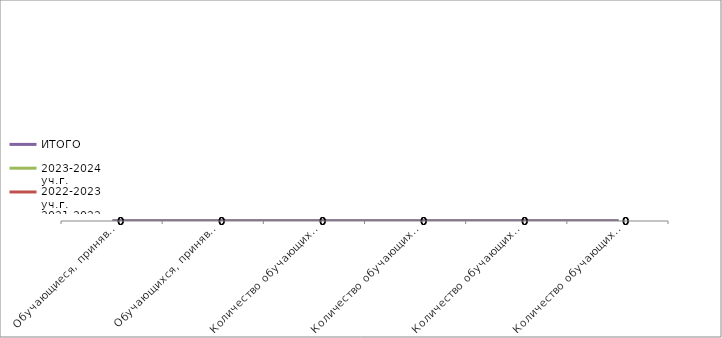
| Category | 2021-2022 уч.г. | 2022-2023 уч.г. | 2023-2024 уч.г. | ИТОГО |
|---|---|---|---|---|
| Обучающиеся, принявшие участие в сессиях профессионального ознакомления на базе ОО  | 0 | 0 | 0 | 0 |
| Обучающихся, принявшие участие в сессиях профессионального ознакомления на территории организаций-партнёров  | 0 | 0 | 0 | 0 |
| Количество обучающихся, принявших участие в профессиональных пробах на базе ОО  | 0 | 0 | 0 | 0 |
| Количество обучающихся, принявших участие в профессиональных пробах на территории организации-партнёра | 0 | 0 | 0 | 0 |
| Количество обучающихся, принявших участие в профориентационных мероприятиях, проведённых по инициативе членов Клуба выпускников | 0 | 0 | 0 | 0 |
| Количество обучающихся, принявших участие в профориентационных конкурсах  | 0 | 0 | 0 | 0 |